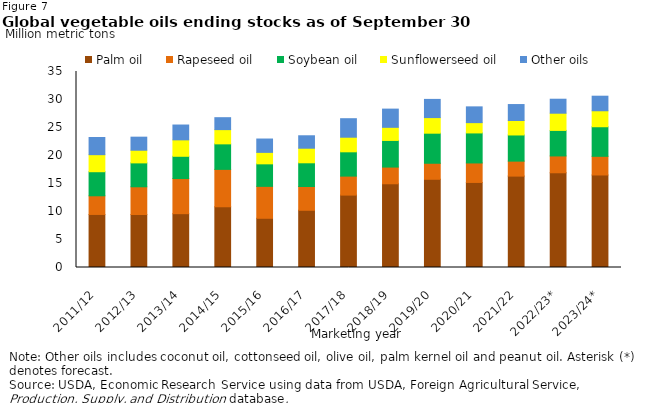
| Category | Palm oil | Rapeseed oil | Soybean oil | Sunflowerseed oil | Other oils |
|---|---|---|---|---|---|
| 2011/12 | 9.475 | 3.329 | 4.299 | 3.046 | 3.064 |
| 2012/13 | 9.467 | 4.947 | 4.268 | 2.26 | 2.332 |
| 2013/14 | 9.612 | 6.274 | 3.973 | 2.935 | 2.649 |
| 2014/15 | 10.844 | 6.679 | 4.556 | 2.543 | 2.131 |
| 2015/16 | 8.79 | 5.699 | 4.022 | 2.046 | 2.386 |
| 2016/17 | 10.218 | 4.243 | 4.237 | 2.603 | 2.222 |
| 2017/18 | 12.929 | 3.39 | 4.34 | 2.606 | 3.306 |
| 2018/19 | 14.951 | 2.983 | 4.756 | 2.342 | 3.252 |
| 2019/20 | 15.755 | 2.859 | 5.37 | 2.786 | 3.248 |
| 2020/21 | 15.189 | 3.48 | 5.361 | 1.84 | 2.815 |
| 2021/22 | 16.32 | 2.675 | 4.67 | 2.581 | 2.853 |
| 2022/23* | 16.916 | 3.005 | 4.558 | 3.074 | 2.498 |
| 2023/24* | 16.522 | 3.333 | 5.28 | 2.854 | 2.601 |